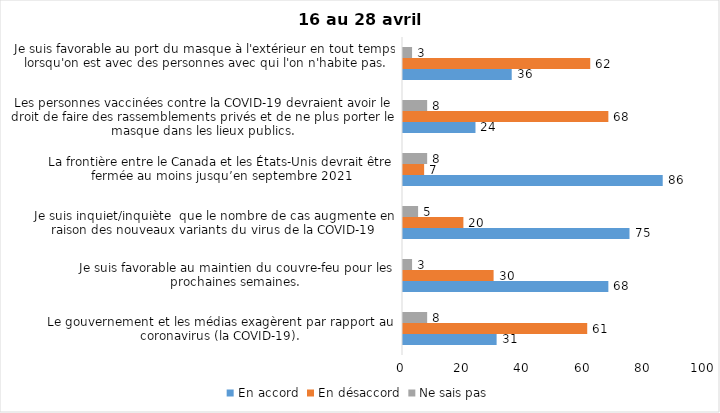
| Category | En accord | En désaccord | Ne sais pas |
|---|---|---|---|
| Le gouvernement et les médias exagèrent par rapport au coronavirus (la COVID-19). | 31 | 61 | 8 |
| Je suis favorable au maintien du couvre-feu pour les prochaines semaines. | 68 | 30 | 3 |
| Je suis inquiet/inquiète  que le nombre de cas augmente en raison des nouveaux variants du virus de la COVID-19 | 75 | 20 | 5 |
| La frontière entre le Canada et les États-Unis devrait être fermée au moins jusqu’en septembre 2021 | 86 | 7 | 8 |
| Les personnes vaccinées contre la COVID-19 devraient avoir le droit de faire des rassemblements privés et de ne plus porter le masque dans les lieux publics. | 24 | 68 | 8 |
| Je suis favorable au port du masque à l'extérieur en tout temps lorsqu'on est avec des personnes avec qui l'on n'habite pas. | 36 | 62 | 3 |